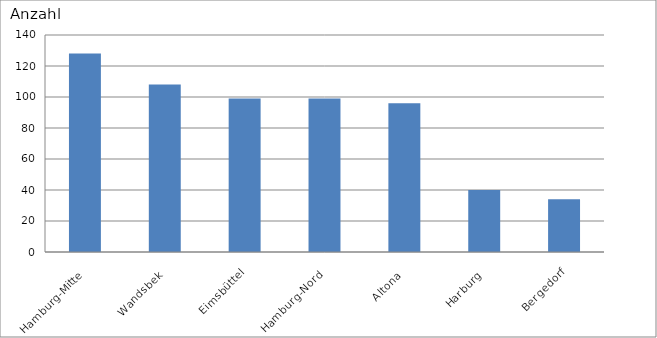
| Category | Hamburg-Mitte |
|---|---|
| Hamburg-Mitte | 128 |
| Wandsbek | 108 |
| Eimsbüttel | 99 |
| Hamburg-Nord | 99 |
| Altona | 96 |
| Harburg | 40 |
| Bergedorf | 34 |